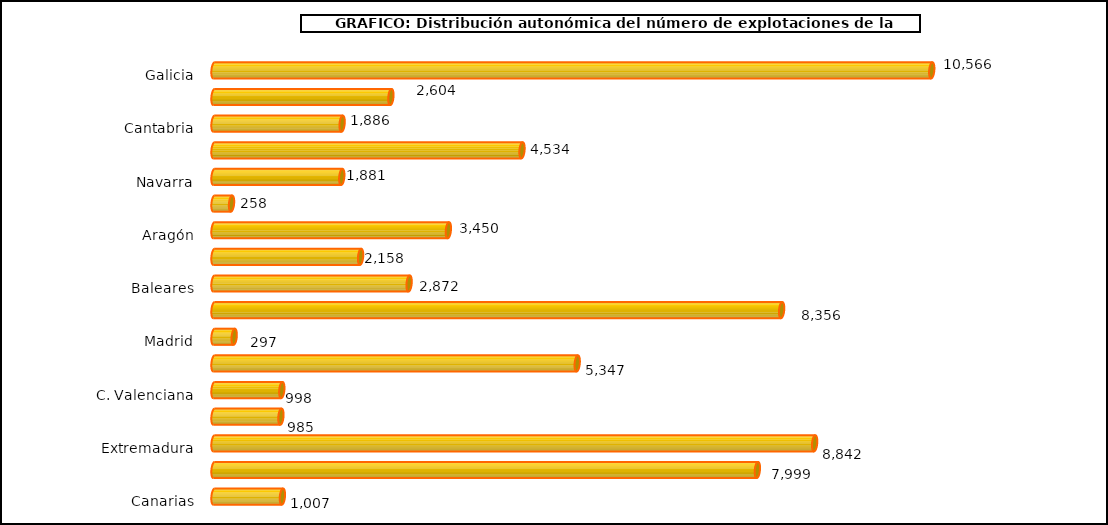
| Category | num. Explotaciones |
|---|---|
|   Galicia | 10566 |
|   P. de Asturias | 2604 |
|   Cantabria | 1886 |
|   País Vasco | 4534 |
|   Navarra | 1881 |
|   La Rioja | 258 |
|   Aragón | 3450 |
|   Cataluña | 2158 |
|   Baleares | 2872 |
|   Castilla y León | 8356 |
|   Madrid | 297 |
|   Castilla – La Mancha | 5347 |
|   C. Valenciana | 998 |
|   R. de Murcia | 985 |
|   Extremadura | 8842 |
|   Andalucía | 7999 |
|   Canarias | 1007 |